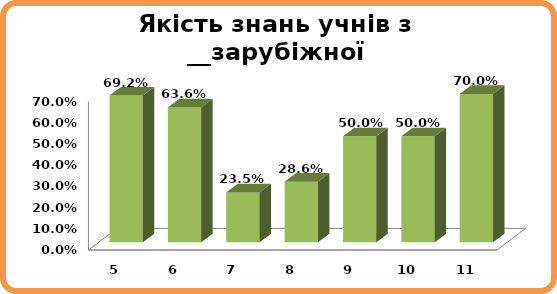
| Category | Series 0 |
|---|---|
| 5.0 | 0.692 |
| 6.0 | 0.636 |
| 7.0 | 0.235 |
| 8.0 | 0.286 |
| 9.0 | 0.5 |
| 10.0 | 0.5 |
| 11.0 | 0.7 |